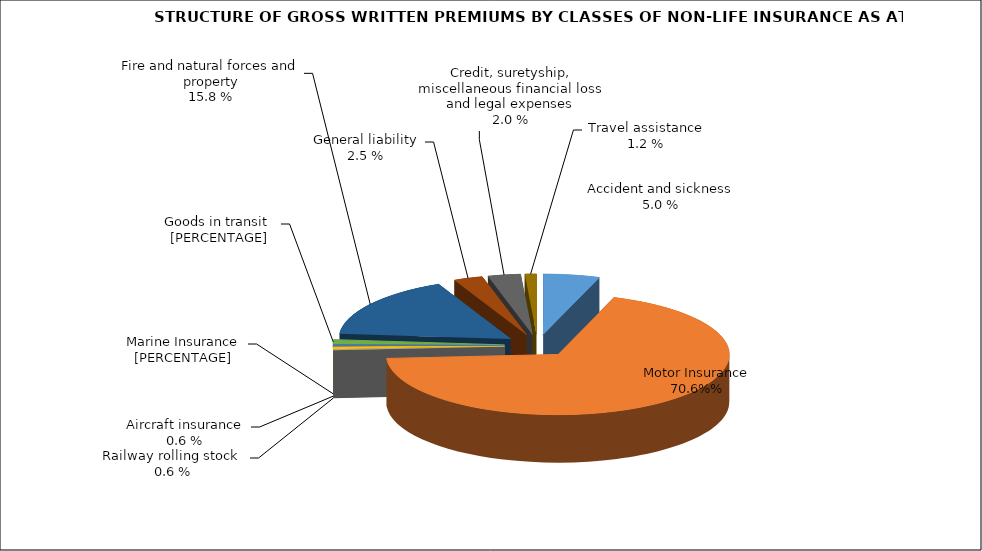
| Category | Злополука и заболяване МПС Релсови превозни средства Летателни апарати Плаванелни съдове Товари по време на превоз Пожар и природни бедствия и други щети на имущество Обща гражданска отговорност Кредити, гаранции, разни финансови загуби и правни разноски |
|---|---|
| Злополука и заболяване | 0.053 |
| МПС | 0.686 |
| Релсови превозни средства | 0.001 |
| Летателни апарати | 0.007 |
| Плаванелни съдове | 0.004 |
| Товари по време на превоз | 0.012 |
| Пожар и природни бедствия и други щети на имущество | 0.167 |
| Обща гражданска отговорност | 0.027 |
| Кредити, гаранции, разни финансови загуби и правни разноски | 0.031 |
| Помощ при пътуване | 0.011 |